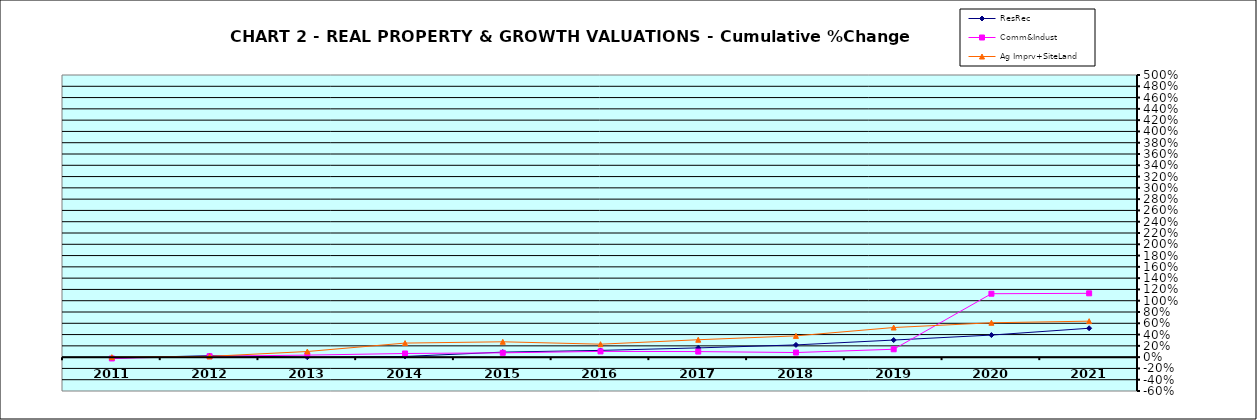
| Category | ResRec | Comm&Indust | Ag Imprv+SiteLand |
|---|---|---|---|
| 2011.0 | -0.018 | -0.023 | 0 |
| 2012.0 | 0.026 | 0.016 | 0.013 |
| 2013.0 | -0.002 | 0.036 | 0.1 |
| 2014.0 | 0.012 | 0.065 | 0.249 |
| 2015.0 | 0.089 | 0.076 | 0.272 |
| 2016.0 | 0.12 | 0.102 | 0.23 |
| 2017.0 | 0.164 | 0.099 | 0.308 |
| 2018.0 | 0.217 | 0.082 | 0.377 |
| 2019.0 | 0.303 | 0.14 | 0.525 |
| 2020.0 | 0.391 | 1.124 | 0.609 |
| 2021.0 | 0.512 | 1.131 | 0.638 |